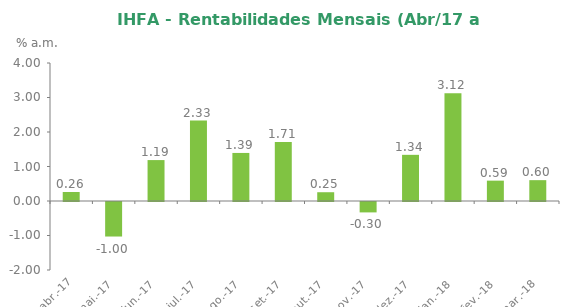
| Category | Series 0 |
|---|---|
| 2017-04-28 | 0.26 |
| 2017-05-31 | -1.001 |
| 2017-06-30 | 1.186 |
| 2017-07-31 | 2.33 |
| 2017-08-31 | 1.393 |
| 2017-09-30 | 1.712 |
| 2017-10-31 | 0.254 |
| 2017-11-30 | -0.301 |
| 2017-12-31 | 1.338 |
| 2018-01-31 | 3.12 |
| 2018-02-28 | 0.59 |
| 2018-03-31 | 0.604 |